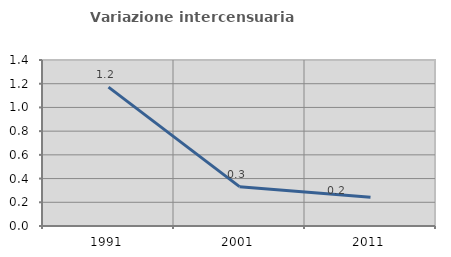
| Category | Variazione intercensuaria annua |
|---|---|
| 1991.0 | 1.172 |
| 2001.0 | 0.332 |
| 2011.0 | 0.243 |